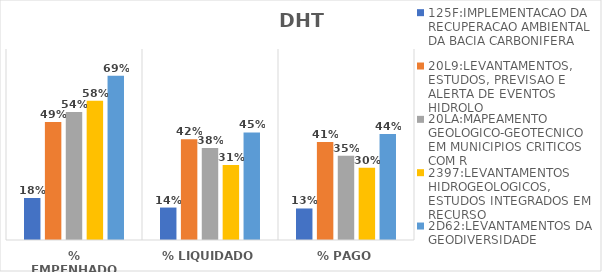
| Category | 125F:IMPLEMENTACAO DA RECUPERACAO AMBIENTAL DA BACIA CARBONIFERA | 20L9:LEVANTAMENTOS, ESTUDOS, PREVISAO E ALERTA DE EVENTOS HIDROLO | 20LA:MAPEAMENTO GEOLOGICO-GEOTECNICO EM MUNICIPIOS CRITICOS COM R | 2397:LEVANTAMENTOS HIDROGEOLOGICOS, ESTUDOS INTEGRADOS EM RECURSO | 2D62:LEVANTAMENTOS DA GEODIVERSIDADE |
|---|---|---|---|---|---|
| % EMPENHADO | 0.176 | 0.494 | 0.536 | 0.583 | 0.688 |
| % LIQUIDADO | 0.136 | 0.422 | 0.385 | 0.314 | 0.451 |
| % PAGO | 0.132 | 0.41 | 0.353 | 0.303 | 0.444 |